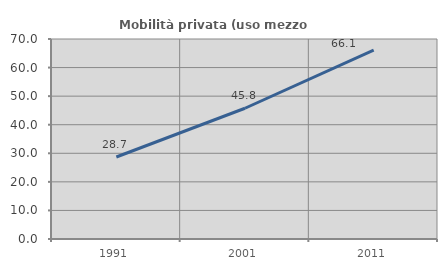
| Category | Mobilità privata (uso mezzo privato) |
|---|---|
| 1991.0 | 28.702 |
| 2001.0 | 45.763 |
| 2011.0 | 66.14 |